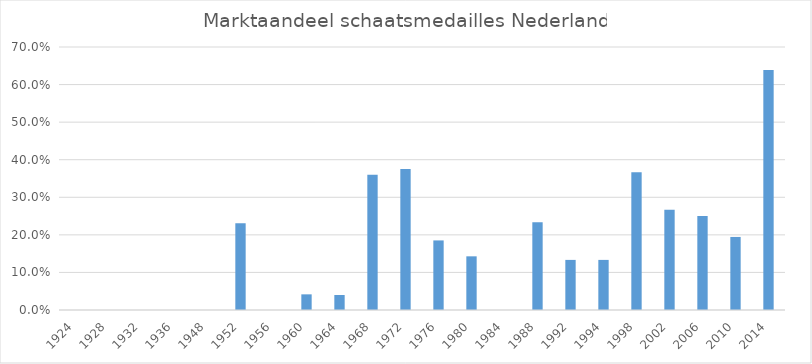
| Category | M.A. medailles |
|---|---|
| 1924.0 | 0 |
| 1928.0 | 0 |
| 1932.0 | 0 |
| 1936.0 | 0 |
| 1948.0 | 0 |
| 1952.0 | 0.231 |
| 1956.0 | 0 |
| 1960.0 | 0.042 |
| 1964.0 | 0.04 |
| 1968.0 | 0.36 |
| 1972.0 | 0.375 |
| 1976.0 | 0.185 |
| 1980.0 | 0.143 |
| 1984.0 | 0 |
| 1988.0 | 0.233 |
| 1992.0 | 0.133 |
| 1994.0 | 0.133 |
| 1998.0 | 0.367 |
| 2002.0 | 0.267 |
| 2006.0 | 0.25 |
| 2010.0 | 0.194 |
| 2014.0 | 0.639 |